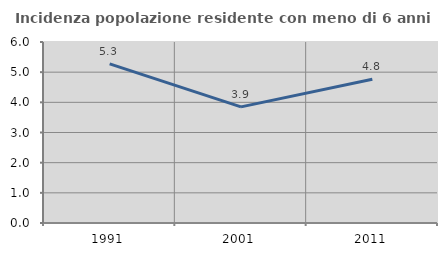
| Category | Incidenza popolazione residente con meno di 6 anni |
|---|---|
| 1991.0 | 5.276 |
| 2001.0 | 3.85 |
| 2011.0 | 4.765 |